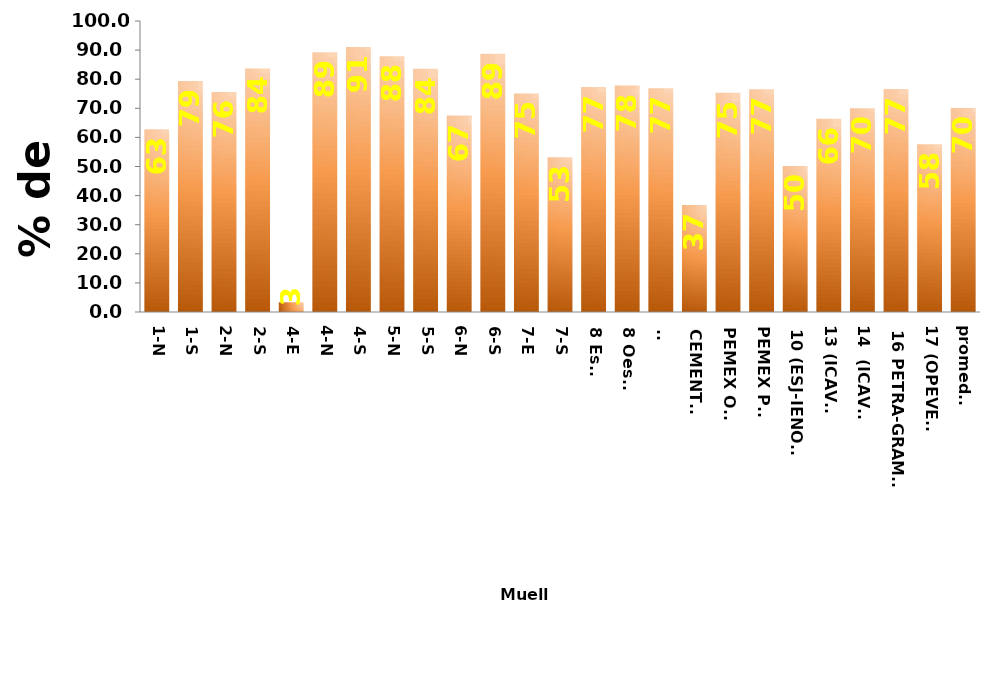
| Category | ene-may 2023 |
|---|---|
| 1-N | 62.767 |
| 1-S | 79.41 |
| 2-N | 75.579 |
| 2-S | 83.717 |
| 4-E | 3.347 |
| 4-N | 89.289 |
| 4-S | 91.043 |
| 5-N | 87.891 |
| 5-S | 83.618 |
| 6-N | 67.496 |
| 6-S | 88.768 |
| 7-E | 75.11 |
| 7-S | 53.174 |
| 8 Este | 77.279 |
| 8 Oeste | 77.823 |
| 9- | 76.882 |
| CEMENTOS | 36.812 |
| PEMEX OTE | 75.361 |
| PEMEX PTE | 76.526 |
| 10 (ESJ-IENOVA) | 50.188 |
| 13 (ICAVE) | 66.422 |
| 14  (ICAVE) | 70.022 |
| 16 PETRA-GRAMOSA | 76.598 |
| 17 (OPEVER) | 57.612 |
| promedio | 70.079 |